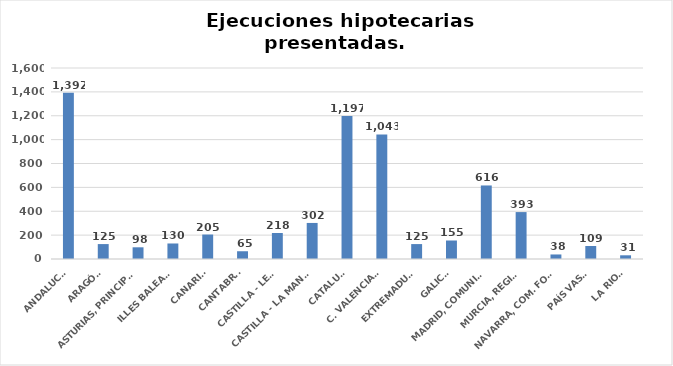
| Category | Series 0 |
|---|---|
| ANDALUCÍA | 1392 |
| ARAGÓN | 125 |
| ASTURIAS, PRINCIPADO | 98 |
| ILLES BALEARS | 130 |
| CANARIAS | 205 |
| CANTABRIA | 65 |
| CASTILLA - LEÓN | 218 |
| CASTILLA - LA MANCHA | 302 |
| CATALUÑA | 1197 |
| C. VALENCIANA | 1043 |
| EXTREMADURA | 125 |
| GALICIA | 155 |
| MADRID, COMUNIDAD | 616 |
| MURCIA, REGIÓN | 393 |
| NAVARRA, COM. FORAL | 38 |
| PAÍS VASCO | 109 |
| LA RIOJA | 31 |